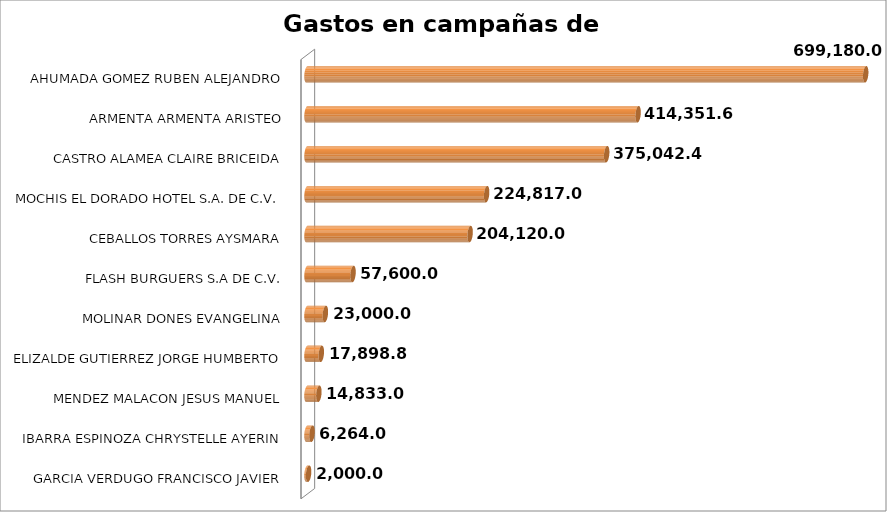
| Category | SUMA |
|---|---|
| GARCIA VERDUGO FRANCISCO JAVIER | 2000 |
| IBARRA ESPINOZA CHRYSTELLE AYERIN | 6264 |
| MENDEZ MALACON JESUS MANUEL | 14833.04 |
| ELIZALDE GUTIERREZ JORGE HUMBERTO | 17898.8 |
| MOLINAR DONES EVANGELINA | 23000 |
| FLASH BURGUERS S.A DE C.V. | 57600 |
| CEBALLOS TORRES AYSMARA | 204120 |
| MOCHIS EL DORADO HOTEL S.A. DE C.V. | 224817 |
| CASTRO ALAMEA CLAIRE BRICEIDA | 375042.4 |
| ARMENTA ARMENTA ARISTEO | 414351.6 |
| AHUMADA GOMEZ RUBEN ALEJANDRO | 699180.03 |